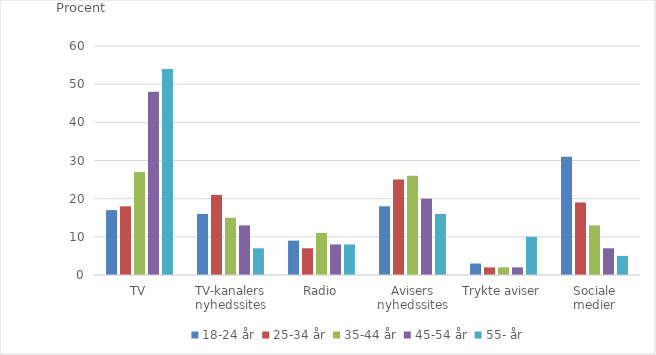
| Category | 18-24 år | 25-34 år | 35-44 år | 45-54 år | 55- år |
|---|---|---|---|---|---|
| TV | 17 | 18 | 27 | 48 | 54 |
| TV-kanalers nyhedssites | 16 | 21 | 15 | 13 | 7 |
| Radio | 9 | 7 | 11 | 8 | 8 |
| Avisers nyhedssites | 18 | 25 | 26 | 20 | 16 |
| Trykte aviser | 3 | 2 | 2 | 2 | 10 |
| Sociale medier | 31 | 19 | 13 | 7 | 5 |